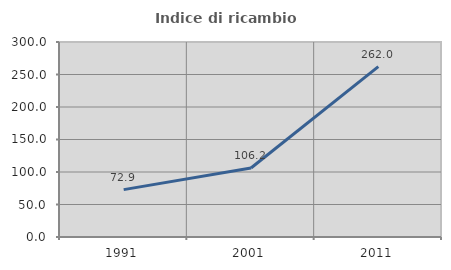
| Category | Indice di ricambio occupazionale  |
|---|---|
| 1991.0 | 72.892 |
| 2001.0 | 106.174 |
| 2011.0 | 262.022 |